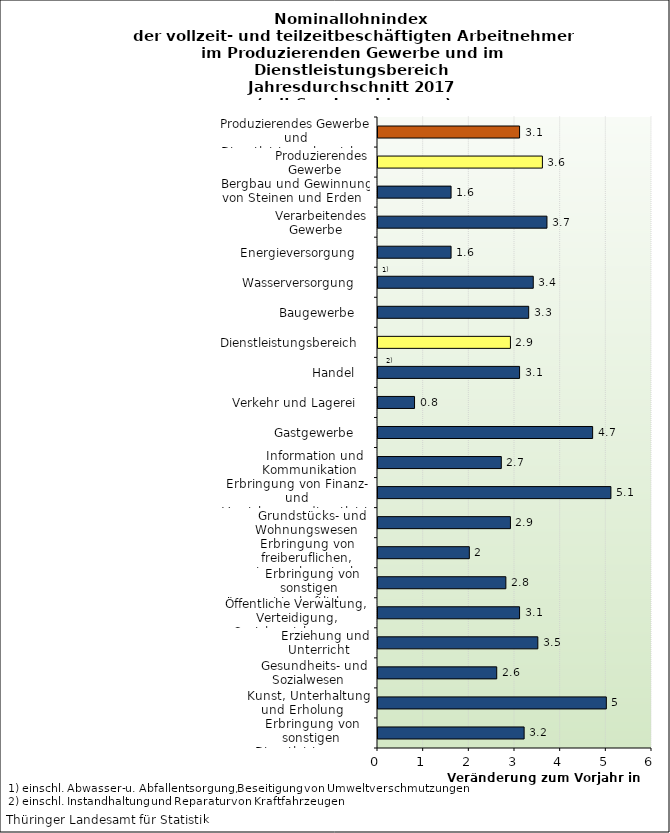
| Category | Series 0 |
|---|---|
| Erbringung von sonstigen Dienstleistungen    | 3.2 |
| Kunst, Unterhaltung und Erholung    | 5 |
| Gesundheits- und Sozialwesen    | 2.6 |
| Erziehung und Unterricht    | 3.5 |
| Öffentliche Verwaltung, Verteidigung, Sozialversicherung    | 3.1 |
| Erbringung von sonstigen  wirtschaftlichen Dienstleistungen    | 2.8 |
| Erbringung von freiberuflichen, wissensch. u. techn. Dienstleistungen    | 2 |
| Grundstücks- und Wohnungswesen    | 2.9 |
| Erbringung von Finanz- und Versicherungsdienstleistungen    | 5.1 |
| Information und Kommunikation    | 2.7 |
| Gastgewerbe    | 4.7 |
| Verkehr und Lagerei    | 0.8 |
| Handel    | 3.1 |
| Dienstleistungsbereich    | 2.9 |
| Baugewerbe    | 3.3 |
| Wasserversorgung    | 3.4 |
| Energieversorgung    | 1.6 |
| Verarbeitendes Gewerbe    | 3.7 |
| Bergbau und Gewinnung von Steinen und Erden    | 1.6 |
| Produzierendes Gewerbe    | 3.6 |
| Produzierendes Gewerbe und Dienstleistungsbereich    | 3.1 |